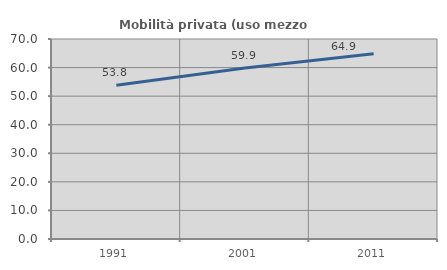
| Category | Mobilità privata (uso mezzo privato) |
|---|---|
| 1991.0 | 53.836 |
| 2001.0 | 59.878 |
| 2011.0 | 64.853 |